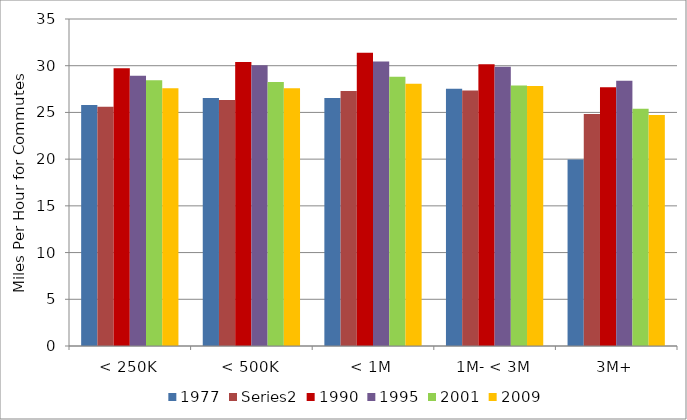
| Category | 1977 | Series 1 | 1990 | 1995 | 2001 | 2009 |
|---|---|---|---|---|---|---|
| < 250K |  |  | 29.73 | 28.93 | 28.45 | 27.587 |
| < 500K |  |  | 30.39 | 30.04 | 28.26 | 27.587 |
| < 1M |  |  | 31.4 | 30.44 | 28.81 | 28.061 |
| 1M- < 3M |  |  | 30.15 | 29.9 | 27.89 | 27.84 |
| 3M+ |  |  | 27.69 | 28.38 | 25.39 | 24.729 |